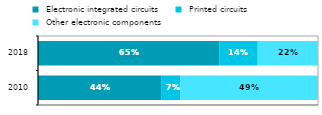
| Category |  Electronic integrated circuits |  Printed circuits |  Other electronic components |
|---|---|---|---|
| 2010 | 0.442 | 0.067 | 0.491 |
| 2018 | 0.647 | 0.138 | 0.215 |